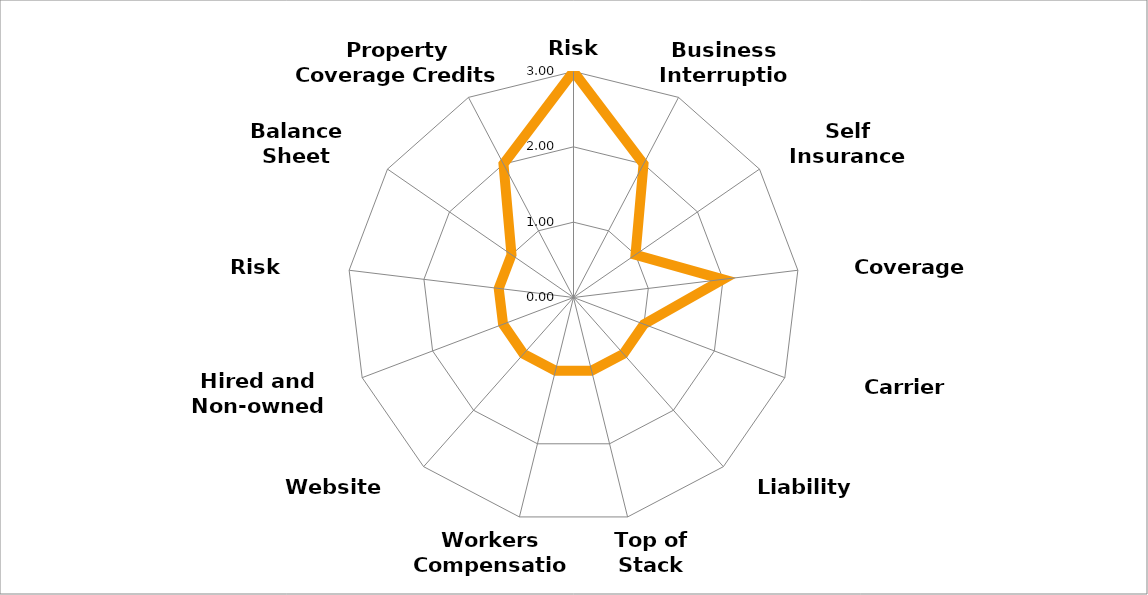
| Category | Series 0 |
|---|---|
| Risk Survey | 3 |
| Business Interruption | 2 |
| Self Insurance Strategy | 1 |
| Coverage Analysis | 2 |
| Carrier Comparision | 1 |
| Liability Limits | 1 |
| Top of Stack Submission | 1 |
| Workers Compensation | 1 |
| Website Review | 1 |
| Hired and Non-owned auto | 1 |
| Risk Tolerance | 1 |
| Balance Sheet Protection | 1 |
| Property Coverage Credits | 2 |